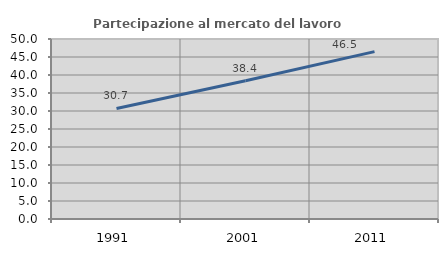
| Category | Partecipazione al mercato del lavoro  femminile |
|---|---|
| 1991.0 | 30.709 |
| 2001.0 | 38.415 |
| 2011.0 | 46.5 |